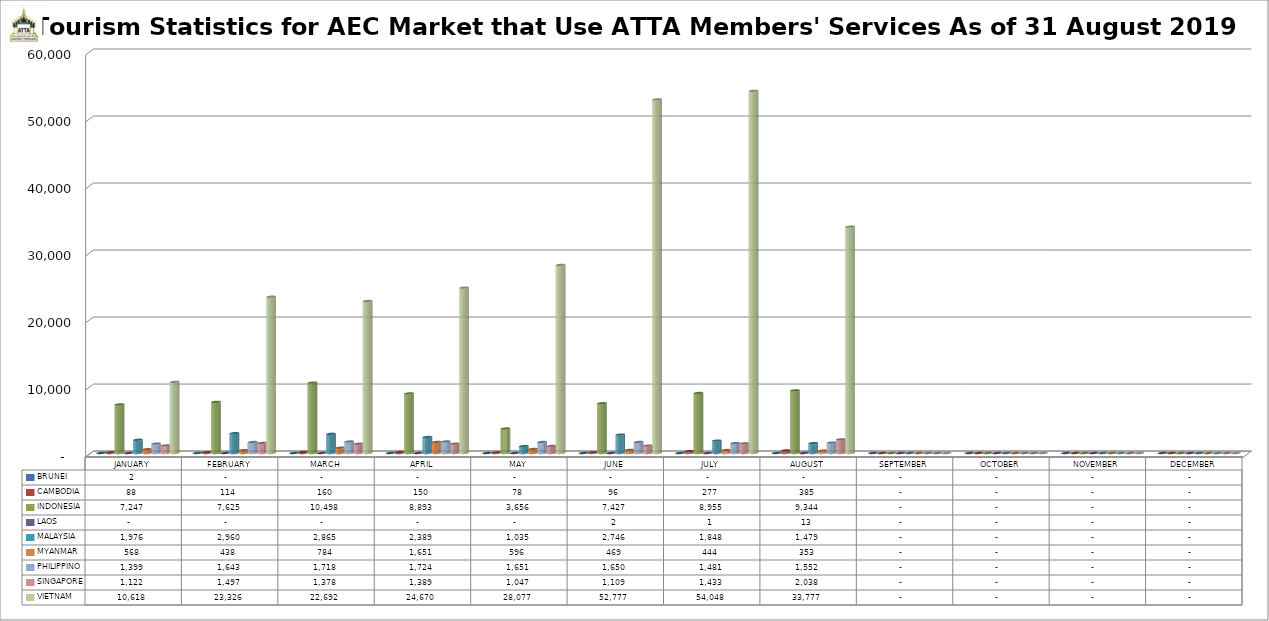
| Category | BRUNEI | CAMBODIA | INDONESIA | LAOS | MALAYSIA | MYANMAR | PHILIPPINO | SINGAPORE | VIETNAM |
|---|---|---|---|---|---|---|---|---|---|
| JANUARY | 2 | 88 | 7247 | 0 | 1976 | 568 | 1399 | 1122 | 10618 |
| FEBRUARY | 0 | 114 | 7625 | 0 | 2960 | 438 | 1643 | 1497 | 23326 |
| MARCH | 0 | 160 | 10498 | 0 | 2865 | 784 | 1718 | 1378 | 22692 |
| APRIL | 0 | 150 | 8893 | 0 | 2389 | 1651 | 1724 | 1389 | 24670 |
| MAY | 0 | 78 | 3656 | 0 | 1035 | 596 | 1651 | 1047 | 28077 |
| JUNE | 0 | 96 | 7427 | 2 | 2746 | 469 | 1650 | 1109 | 52777 |
| JULY | 0 | 277 | 8955 | 1 | 1848 | 444 | 1481 | 1433 | 54048 |
| AUGUST | 0 | 385 | 9344 | 13 | 1479 | 353 | 1552 | 2038 | 33777 |
| SEPTEMBER | 0 | 0 | 0 | 0 | 0 | 0 | 0 | 0 | 0 |
| OCTOBER | 0 | 0 | 0 | 0 | 0 | 0 | 0 | 0 | 0 |
| NOVEMBER | 0 | 0 | 0 | 0 | 0 | 0 | 0 | 0 | 0 |
| DECEMBER | 0 | 0 | 0 | 0 | 0 | 0 | 0 | 0 | 0 |